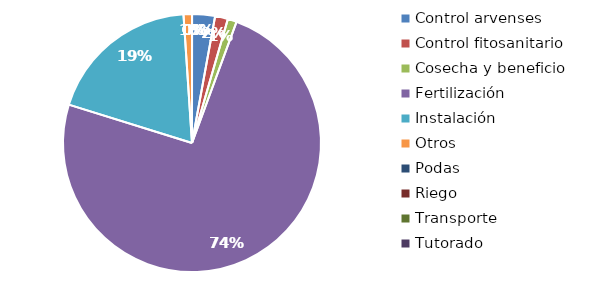
| Category | Valor |
|---|---|
| Control arvenses | 245000 |
| Control fitosanitario | 137515 |
| Cosecha y beneficio | 96000 |
| Fertilización | 6329286 |
| Instalación | 1633100 |
| Otros | 90000 |
| Podas | 0 |
| Riego | 0 |
| Transporte | 0 |
| Tutorado | 0 |